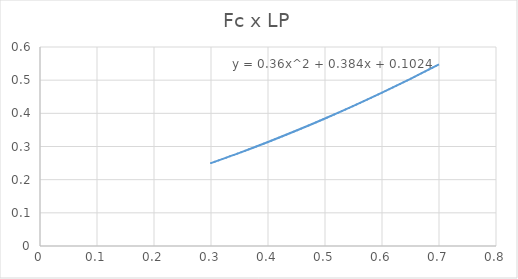
| Category | Series 0 |
|---|---|
| 0.3 | 0.25 |
| 0.35 | 0.281 |
| 0.4 | 0.314 |
| 0.45 | 0.348 |
| 0.5 | 0.384 |
| 0.55 | 0.422 |
| 0.6 | 0.462 |
| 0.65 | 0.504 |
| 0.7 | 0.548 |